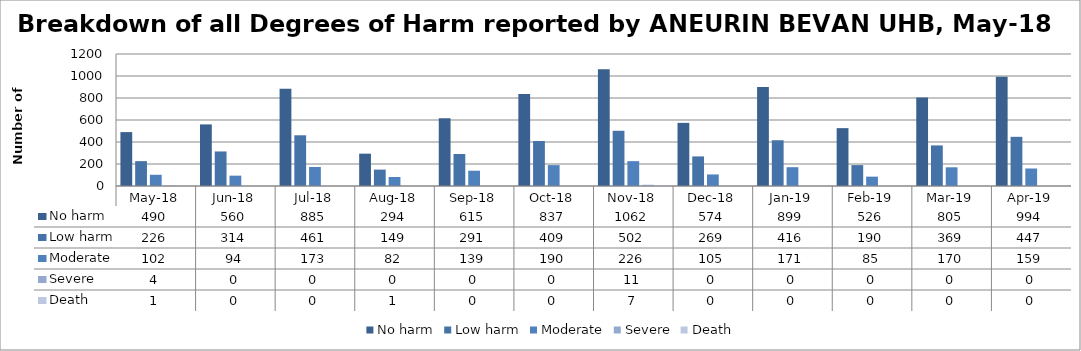
| Category | No harm | Low harm | Moderate | Severe | Death |
|---|---|---|---|---|---|
| May-18 | 490 | 226 | 102 | 4 | 1 |
| Jun-18 | 560 | 314 | 94 | 0 | 0 |
| Jul-18 | 885 | 461 | 173 | 0 | 0 |
| Aug-18 | 294 | 149 | 82 | 0 | 1 |
| Sep-18 | 615 | 291 | 139 | 0 | 0 |
| Oct-18 | 837 | 409 | 190 | 0 | 0 |
| Nov-18 | 1062 | 502 | 226 | 11 | 7 |
| Dec-18 | 574 | 269 | 105 | 0 | 0 |
| Jan-19 | 899 | 416 | 171 | 0 | 0 |
| Feb-19 | 526 | 190 | 85 | 0 | 0 |
| Mar-19 | 805 | 369 | 170 | 0 | 0 |
| Apr-19 | 994 | 447 | 159 | 0 | 0 |